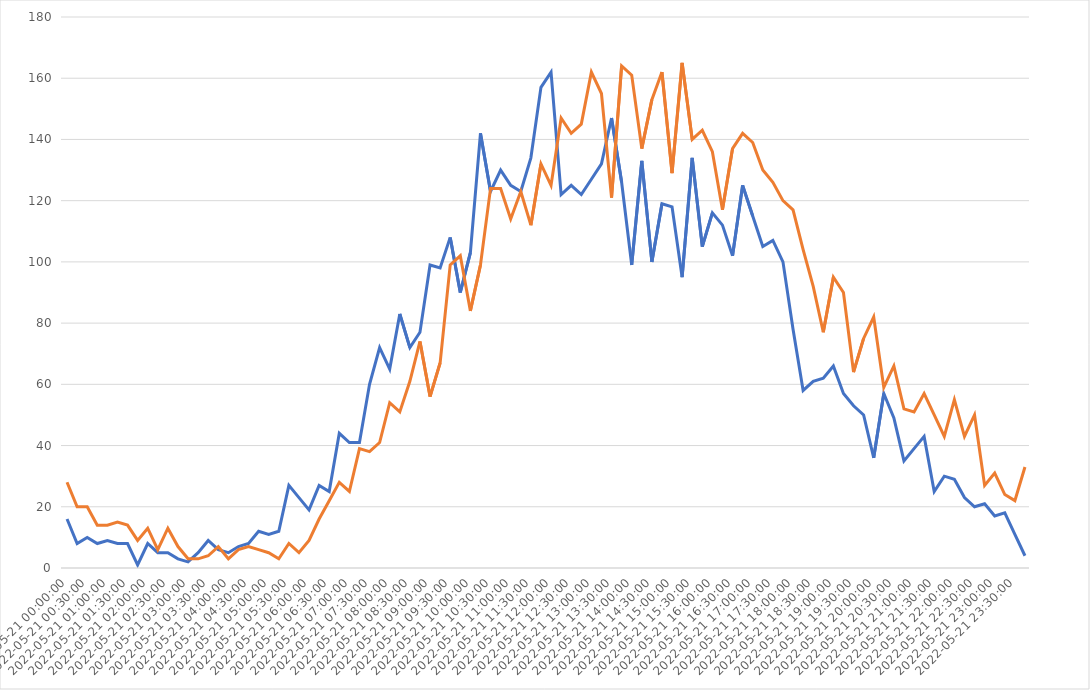
| Category | Eastbound | Westbound |
|---|---|---|
| 2022-05-21 | 16 | 28 |
| 2022-05-21 00:15:00 | 8 | 20 |
| 2022-05-21 00:30:00 | 10 | 20 |
| 2022-05-21 00:45:00 | 8 | 14 |
| 2022-05-21 01:00:00 | 9 | 14 |
| 2022-05-21 01:15:00 | 8 | 15 |
| 2022-05-21 01:30:00 | 8 | 14 |
| 2022-05-21 01:45:00 | 1 | 9 |
| 2022-05-21 02:00:00 | 8 | 13 |
| 2022-05-21 02:15:00 | 5 | 6 |
| 2022-05-21 02:30:00 | 5 | 13 |
| 2022-05-21 02:45:00 | 3 | 7 |
| 2022-05-21 03:00:00 | 2 | 3 |
| 2022-05-21 03:15:00 | 5 | 3 |
| 2022-05-21 03:30:00 | 9 | 4 |
| 2022-05-21 03:45:00 | 6 | 7 |
| 2022-05-21 04:00:00 | 5 | 3 |
| 2022-05-21 04:15:00 | 7 | 6 |
| 2022-05-21 04:30:00 | 8 | 7 |
| 2022-05-21 04:45:00 | 12 | 6 |
| 2022-05-21 05:00:00 | 11 | 5 |
| 2022-05-21 05:15:00 | 12 | 3 |
| 2022-05-21 05:30:00 | 27 | 8 |
| 2022-05-21 05:45:00 | 23 | 5 |
| 2022-05-21 06:00:00 | 19 | 9 |
| 2022-05-21 06:15:00 | 27 | 16 |
| 2022-05-21 06:30:00 | 25 | 22 |
| 2022-05-21 06:45:00 | 44 | 28 |
| 2022-05-21 07:00:00 | 41 | 25 |
| 2022-05-21 07:15:00 | 41 | 39 |
| 2022-05-21 07:30:00 | 60 | 38 |
| 2022-05-21 07:45:00 | 72 | 41 |
| 2022-05-21 08:00:00 | 65 | 54 |
| 2022-05-21 08:15:00 | 83 | 51 |
| 2022-05-21 08:30:00 | 72 | 61 |
| 2022-05-21 08:45:00 | 77 | 74 |
| 2022-05-21 09:00:00 | 99 | 56 |
| 2022-05-21 09:15:00 | 98 | 67 |
| 2022-05-21 09:30:00 | 108 | 99 |
| 2022-05-21 09:45:00 | 90 | 102 |
| 2022-05-21 10:00:00 | 103 | 84 |
| 2022-05-21 10:15:00 | 142 | 99 |
| 2022-05-21 10:30:00 | 123 | 124 |
| 2022-05-21 10:45:00 | 130 | 124 |
| 2022-05-21 11:00:00 | 125 | 114 |
| 2022-05-21 11:15:00 | 123 | 123 |
| 2022-05-21 11:30:00 | 134 | 112 |
| 2022-05-21 11:45:00 | 157 | 132 |
| 2022-05-21 12:00:00 | 162 | 125 |
| 2022-05-21 12:15:00 | 122 | 147 |
| 2022-05-21 12:30:00 | 125 | 142 |
| 2022-05-21 12:45:00 | 122 | 145 |
| 2022-05-21 13:00:00 | 127 | 162 |
| 2022-05-21 13:15:00 | 132 | 155 |
| 2022-05-21 13:30:00 | 147 | 121 |
| 2022-05-21 13:45:00 | 126 | 164 |
| 2022-05-21 14:00:00 | 99 | 161 |
| 2022-05-21 14:15:00 | 133 | 137 |
| 2022-05-21 14:30:00 | 100 | 153 |
| 2022-05-21 14:45:00 | 119 | 162 |
| 2022-05-21 15:00:00 | 118 | 129 |
| 2022-05-21 15:15:00 | 95 | 165 |
| 2022-05-21 15:30:00 | 134 | 140 |
| 2022-05-21 15:45:00 | 105 | 143 |
| 2022-05-21 16:00:00 | 116 | 136 |
| 2022-05-21 16:15:00 | 112 | 117 |
| 2022-05-21 16:30:00 | 102 | 137 |
| 2022-05-21 16:45:00 | 125 | 142 |
| 2022-05-21 17:00:00 | 115 | 139 |
| 2022-05-21 17:15:00 | 105 | 130 |
| 2022-05-21 17:30:00 | 107 | 126 |
| 2022-05-21 17:45:00 | 100 | 120 |
| 2022-05-21 18:00:00 | 78 | 117 |
| 2022-05-21 18:15:00 | 58 | 104 |
| 2022-05-21 18:30:00 | 61 | 92 |
| 2022-05-21 18:45:00 | 62 | 77 |
| 2022-05-21 19:00:00 | 66 | 95 |
| 2022-05-21 19:15:00 | 57 | 90 |
| 2022-05-21 19:30:00 | 53 | 64 |
| 2022-05-21 19:45:00 | 50 | 75 |
| 2022-05-21 20:00:00 | 36 | 82 |
| 2022-05-21 20:15:00 | 57 | 59 |
| 2022-05-21 20:30:00 | 49 | 66 |
| 2022-05-21 20:45:00 | 35 | 52 |
| 2022-05-21 21:00:00 | 39 | 51 |
| 2022-05-21 21:15:00 | 43 | 57 |
| 2022-05-21 21:30:00 | 25 | 50 |
| 2022-05-21 21:45:00 | 30 | 43 |
| 2022-05-21 22:00:00 | 29 | 55 |
| 2022-05-21 22:15:00 | 23 | 43 |
| 2022-05-21 22:30:00 | 20 | 50 |
| 2022-05-21 22:45:00 | 21 | 27 |
| 2022-05-21 23:00:00 | 17 | 31 |
| 2022-05-21 23:15:00 | 18 | 24 |
| 2022-05-21 23:30:00 | 11 | 22 |
| 2022-05-21 23:45:00 | 4 | 33 |